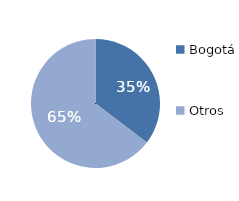
| Category | Series 0 |
|---|---|
| Bogotá | 35.352 |
| Otros | 64.648 |